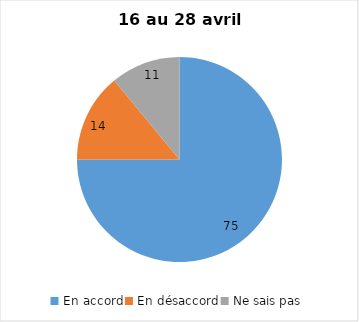
| Category | Series 0 |
|---|---|
| En accord | 75 |
| En désaccord | 14 |
| Ne sais pas | 11 |